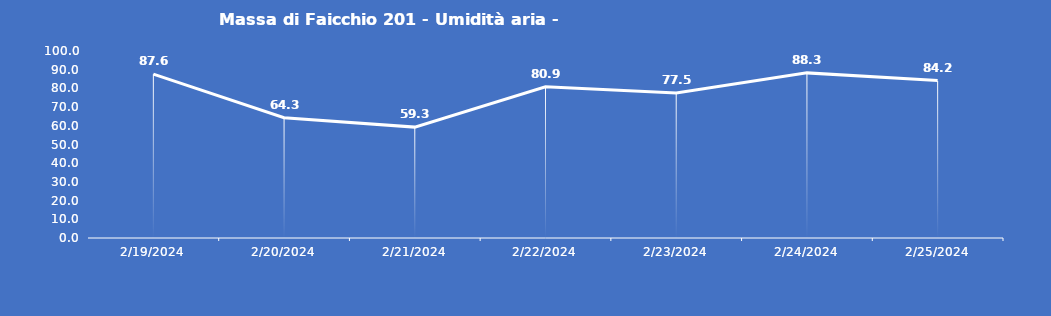
| Category | Massa di Faicchio 201 - Umidità aria - Grezzo (%) |
|---|---|
| 2/19/24 | 87.6 |
| 2/20/24 | 64.3 |
| 2/21/24 | 59.3 |
| 2/22/24 | 80.9 |
| 2/23/24 | 77.5 |
| 2/24/24 | 88.3 |
| 2/25/24 | 84.2 |